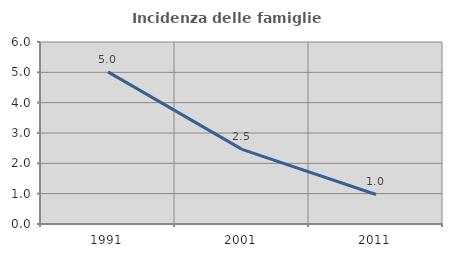
| Category | Incidenza delle famiglie numerose |
|---|---|
| 1991.0 | 5.014 |
| 2001.0 | 2.462 |
| 2011.0 | 0.974 |